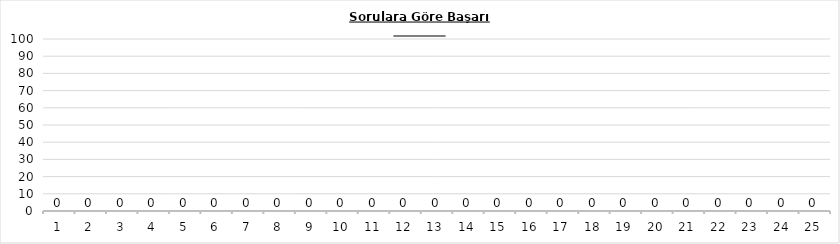
| Category | Series 0 |
|---|---|
| 0 | 0 |
| 1 | 0 |
| 2 | 0 |
| 3 | 0 |
| 4 | 0 |
| 5 | 0 |
| 6 | 0 |
| 7 | 0 |
| 8 | 0 |
| 9 | 0 |
| 10 | 0 |
| 11 | 0 |
| 12 | 0 |
| 13 | 0 |
| 14 | 0 |
| 15 | 0 |
| 16 | 0 |
| 17 | 0 |
| 18 | 0 |
| 19 | 0 |
| 20 | 0 |
| 21 | 0 |
| 22 | 0 |
| 23 | 0 |
| 24 | 0 |